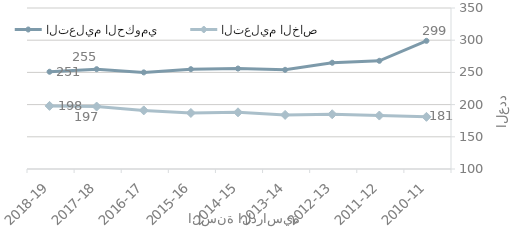
| Category | التعليم الحكومي | التعليم الخاص |
|---|---|---|
| 2010-11 | 299 | 181 |
| 2011-12 | 268 | 183 |
| 2012-13 | 265 | 185 |
| 2013-14 | 254 | 184 |
| 2014-15 | 256 | 188 |
| 2015-16 | 255 | 187 |
| 2016-17 | 250 | 191 |
| 2017-18 | 255 | 197 |
| 2018-19 | 251 | 198 |